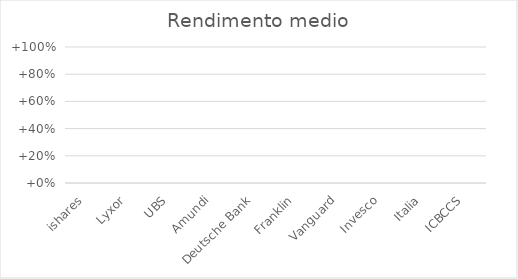
| Category | Rendimento medio |
|---|---|
| ishares | 0 |
| Lyxor | 0 |
| UBS | 0 |
| Amundi | 0 |
| Deutsche Bank | 0 |
| Franklin | 0 |
| Vanguard | 0 |
| Invesco | 0 |
| Italia | 0 |
| ICBCCS | 0 |